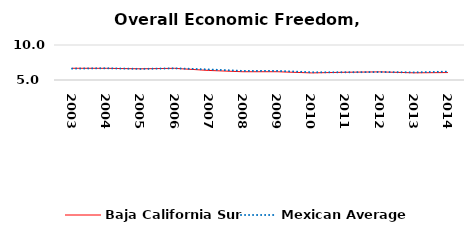
| Category | Baja California Sur | Mexican Average  |
|---|---|---|
| 2003.0 | 6.676 | 6.632 |
| 2004.0 | 6.667 | 6.678 |
| 2005.0 | 6.602 | 6.582 |
| 2006.0 | 6.665 | 6.668 |
| 2007.0 | 6.365 | 6.508 |
| 2008.0 | 6.18 | 6.3 |
| 2009.0 | 6.183 | 6.3 |
| 2010.0 | 6.015 | 6.105 |
| 2011.0 | 6.104 | 6.103 |
| 2012.0 | 6.159 | 6.144 |
| 2013.0 | 6.027 | 6.087 |
| 2014.0 | 6.063 | 6.195 |